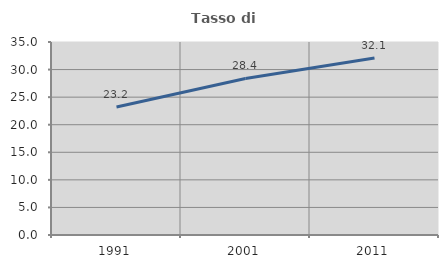
| Category | Tasso di occupazione   |
|---|---|
| 1991.0 | 23.223 |
| 2001.0 | 28.39 |
| 2011.0 | 32.109 |